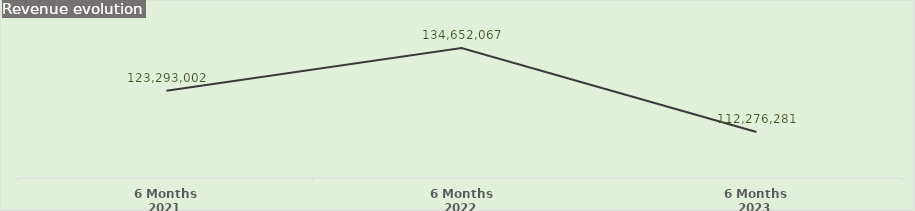
| Category | Series 1 |
|---|---|
| 6 Months 2021 | 123293002 |
| 6 Months 2022 | 134652067 |
| 6 Months 2023 | 112276281 |